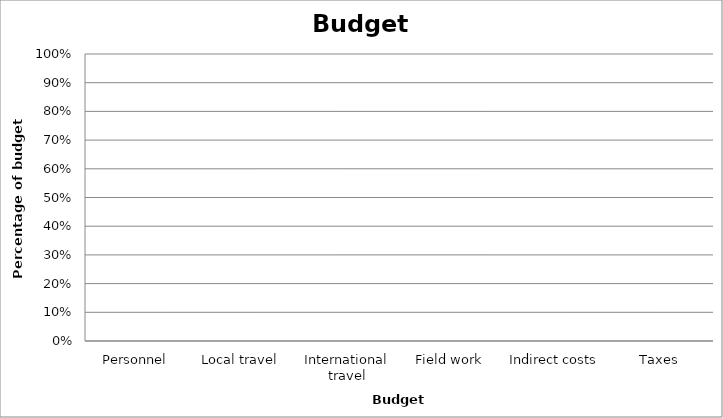
| Category | Percentage of budget (%) |
|---|---|
| Personnel | 0 |
| Local travel | 0 |
| International travel | 0 |
| Field work | 0 |
| Indirect costs | 0 |
| Taxes | 0 |